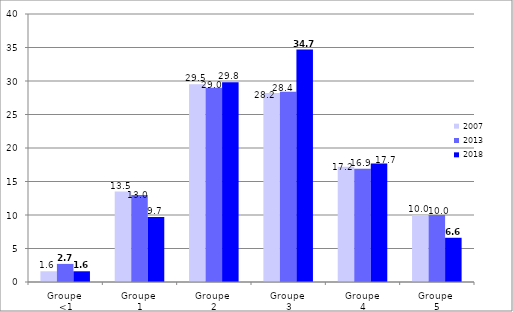
| Category | 2007 | 2013 | 2018 |
|---|---|---|---|
| Groupe 
<1 | 1.6 | 2.7 | 1.6 |
| Groupe 
1 | 13.5 | 13 | 9.7 |
| Groupe 
2 | 29.5 | 29 | 29.8 |
| Groupe 
3 | 28.2 | 28.4 | 34.7 |
| Groupe
4 | 17.2 | 16.9 | 17.7 |
| Groupe 
5 | 10 | 10 | 6.6 |